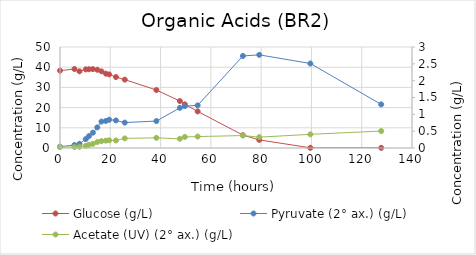
| Category | Glucose (g/L) |
|---|---|
| 0.0 | 38.283 |
| 5.750000000058208 | 39.106 |
| 7.749999999941792 | 37.968 |
| 10.250000000058208 | 38.946 |
| 11.499999999941792 | 38.981 |
| 13.083333333372138 | 39.052 |
| 14.83333333331393 | 38.729 |
| 16.5 | 37.939 |
| 18.249999999941792 | 36.791 |
| 19.583333333255723 | 36.426 |
| 22.250000000058208 | 35.124 |
| 25.749999999941792 | 33.856 |
| 38.33333333325572 | 28.709 |
| 47.683333333348855 | 23.245 |
| 49.66666666668607 | 21.606 |
| 54.75 | 18.113 |
| 72.75 | 6.36 |
| 79.25000000005821 | 4.017 |
| 99.58333333331393 | 0.096 |
| 127.74999999994179 | 0.082 |